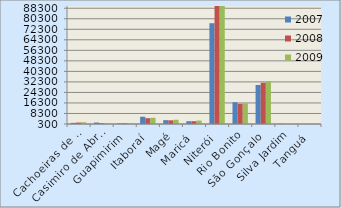
| Category | 2007 | 2008 | 2009 |
|---|---|---|---|
| Cachoeiras de Macacu | 1176 | 1394 | 1634 |
| Casimiro de Abreu | 1425 | 927 | 1056 |
| Guapimirim | 755 | 803 | 712 |
| Itaboraí | 5816 | 4720 | 5024 |
| Magé | 3218 | 3084 | 3524 |
| Maricá | 2415 | 2458 | 2927 |
| Niterói | 76929 | 90633 | 92644 |
| Rio Bonito | 16880 | 15702 | 15997 |
| São Gonçalo | 29984 | 31668 | 32705 |
| Silva Jardim | 431 | 311 | 393 |
| Tanguá | 340 | 355 | 534 |